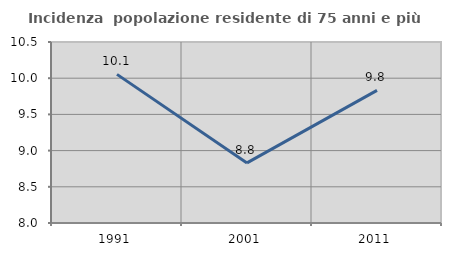
| Category | Incidenza  popolazione residente di 75 anni e più |
|---|---|
| 1991.0 | 10.053 |
| 2001.0 | 8.83 |
| 2011.0 | 9.833 |